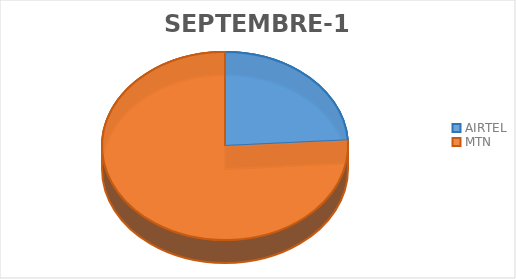
| Category | sept.-19 |
|---|---|
| AIRTEL | 416.955 |
| MTN | 1319.367 |